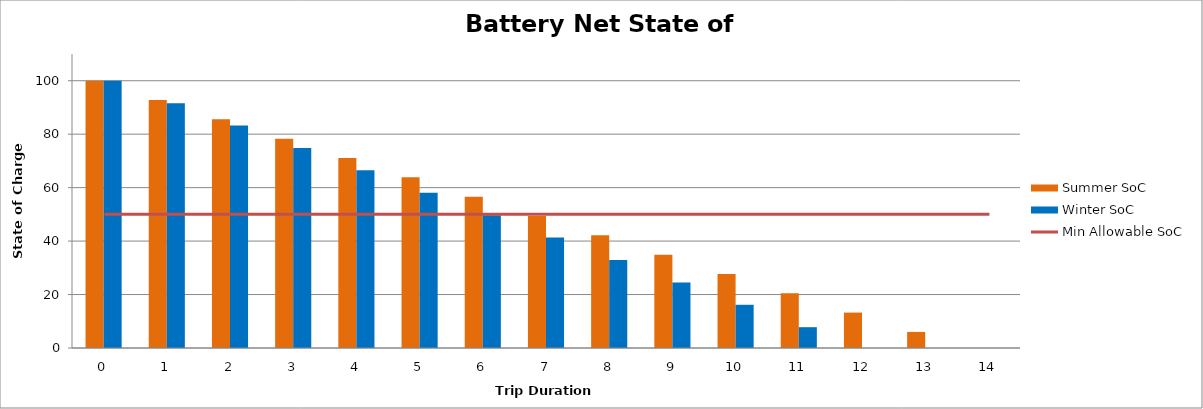
| Category | Summer SoC | Winter SoC |
|---|---|---|
| 0.0 | 100 | 100 |
| 1.0 | 92.771 | 91.617 |
| 2.0 | 85.541 | 83.234 |
| 3.0 | 78.312 | 74.85 |
| 4.0 | 71.082 | 66.467 |
| 5.0 | 63.853 | 58.084 |
| 6.0 | 56.623 | 49.701 |
| 7.0 | 49.394 | 41.318 |
| 8.0 | 42.164 | 32.935 |
| 9.0 | 34.935 | 24.551 |
| 10.0 | 27.705 | 16.168 |
| 11.0 | 20.476 | 7.785 |
| 12.0 | 13.247 | 0 |
| 13.0 | 6.017 | 0 |
| 14.0 | 0 | 0 |